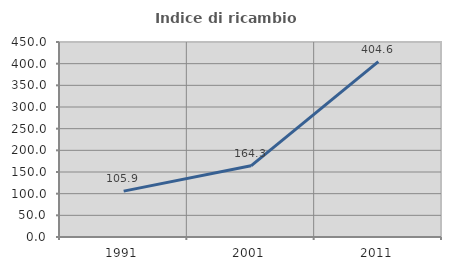
| Category | Indice di ricambio occupazionale  |
|---|---|
| 1991.0 | 105.92 |
| 2001.0 | 164.337 |
| 2011.0 | 404.592 |